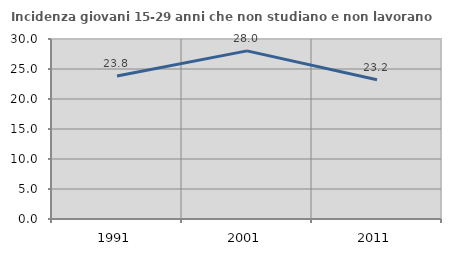
| Category | Incidenza giovani 15-29 anni che non studiano e non lavorano  |
|---|---|
| 1991.0 | 23.837 |
| 2001.0 | 28.02 |
| 2011.0 | 23.204 |